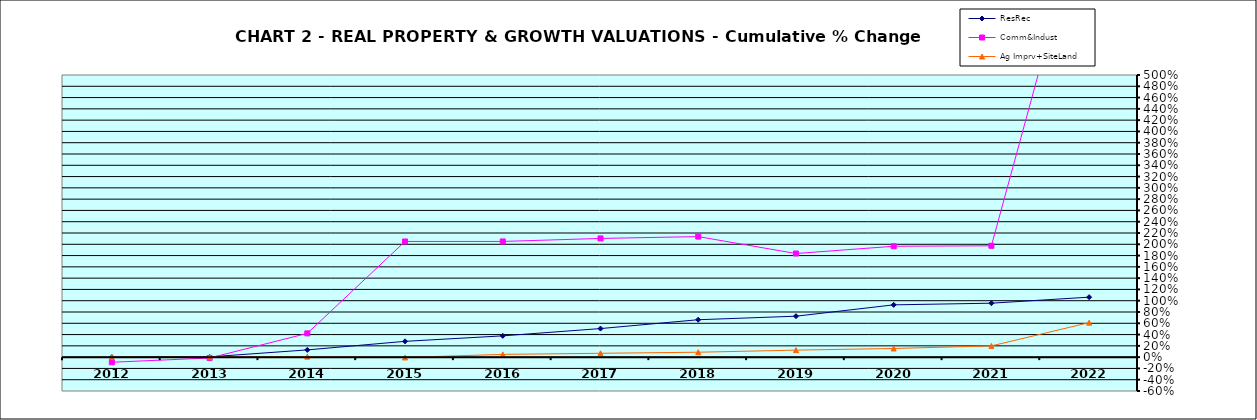
| Category | ResRec | Comm&Indust | Ag Imprv+SiteLand |
|---|---|---|---|
| 2012.0 | 0 | -0.09 | 0 |
| 2013.0 | 0.005 | -0.015 | -0.001 |
| 2014.0 | 0.128 | 0.421 | 0.009 |
| 2015.0 | 0.28 | 2.05 | -0.006 |
| 2016.0 | 0.377 | 2.05 | 0.049 |
| 2017.0 | 0.506 | 2.104 | 0.068 |
| 2018.0 | 0.663 | 2.136 | 0.087 |
| 2019.0 | 0.726 | 1.836 | 0.124 |
| 2020.0 | 0.927 | 1.965 | 0.153 |
| 2021.0 | 0.956 | 1.973 | 0.199 |
| 2022.0 | 1.063 | 8.311 | 0.611 |